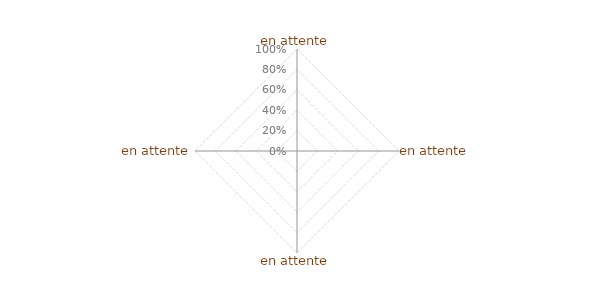
| Category | Article 4 |
|---|---|
| 0 | 0 |
| 1 | 0 |
| 2 | 0 |
| 3 | 0 |